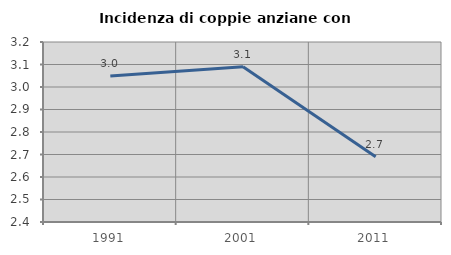
| Category | Incidenza di coppie anziane con figli |
|---|---|
| 1991.0 | 3.049 |
| 2001.0 | 3.09 |
| 2011.0 | 2.69 |